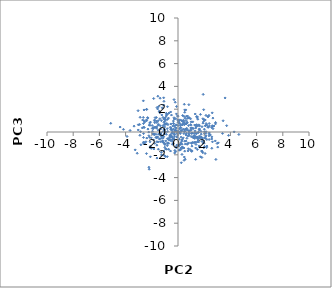
| Category | Series 0 |
|---|---|
| -1.770773030415562 | -0.993 |
| 1.2708219097555649 | -0.432 |
| -0.44278270195938446 | -0.823 |
| -4.41454984896184 | 0.434 |
| -5.133749814817361 | 0.765 |
| 0.8096248342408197 | -0.96 |
| 1.4202953427229223 | 1.36 |
| 0.23058405423241887 | -0.454 |
| 0.8552295948839299 | -0.294 |
| 1.6408714527854273 | -0.354 |
| 1.833774850568358 | -0.83 |
| -0.1593516304962619 | -1.332 |
| -0.5717417460251702 | -1.67 |
| 0.679207117197629 | -0.552 |
| -1.8882535997440149 | 0.294 |
| -0.49223799877375 | -0.358 |
| -0.06607090825979167 | -0.459 |
| -1.8792210986466729 | -0.165 |
| -1.3914535316848833 | 1.681 |
| -0.40398896358329384 | 0.522 |
| -1.2968323454798238 | -0.185 |
| 2.3887938282020356 | -0.079 |
| -0.8154666764966035 | -1.199 |
| 2.0967381269967484 | 0.572 |
| -0.2115033087106913 | 2.611 |
| 0.785444107646185 | -1.469 |
| 0.3004520155237654 | -0.722 |
| 1.484604943745261 | 0.515 |
| -1.5247689200022363 | -0.87 |
| 2.3632321469273667 | -0.333 |
| -1.7730584837282417 | 0.816 |
| -0.5532480216955056 | -0.745 |
| -1.1457778734924273 | 1.279 |
| -1.073083981042333 | 2.692 |
| 0.3237686417166945 | -0.642 |
| 0.8204451007937686 | 0.126 |
| 0.017767917306577397 | 0.048 |
| -1.6029772326678342 | -0.485 |
| 0.733424525418667 | 1.397 |
| -2.106998376268232 | -2.176 |
| -1.6133604774944108 | -1.154 |
| 1.3158840812286252 | 1.58 |
| -0.3334460610834917 | -0.64 |
| 1.0936966474616152 | 0.325 |
| 1.0010432798601487 | 0.889 |
| -0.6698593162144708 | -0.715 |
| -1.6513576834365244 | 1.27 |
| -1.632077399189201 | 0.329 |
| -1.497056879241306 | -1.508 |
| -1.8147000590486022 | -0.244 |
| 0.5056905262095578 | 0.059 |
| 2.581129350229505 | -1.427 |
| 0.09606050562298879 | -0.636 |
| -1.0151898481086152 | 0.923 |
| -2.906987102545036 | -0.288 |
| -0.011819591309675683 | 1.046 |
| 1.9266814156260066 | -0.969 |
| -1.1809288711759587 | -0.341 |
| 1.1841221434657492 | -0.51 |
| -2.157328209027801 | 0.791 |
| -2.6328130863057697 | -0.479 |
| -1.274210288367069 | -0.544 |
| 2.6716049550424503 | 0.289 |
| 1.130813511499732 | -0.098 |
| 1.451557196755277 | -0.542 |
| -2.1384478885076263 | 0.587 |
| 1.6505061755849384 | -1.337 |
| 0.48836575361553874 | 0.643 |
| -0.12989539683335347 | 0.348 |
| 1.1400784164280158 | -0.458 |
| -0.9508500515134614 | 1.05 |
| -2.629831521631357 | -0.14 |
| -1.654619818512633 | -0.499 |
| 2.619792333716752 | 0.553 |
| 0.6360209018334255 | -0.122 |
| -1.6199631464882787 | 0.461 |
| 0.549418678747734 | -2.384 |
| -1.0936541156955037 | -0.417 |
| -0.8559991996326601 | 0.744 |
| 0.5136372295314239 | 0.773 |
| 0.1527905404217271 | 0.729 |
| -1.0848156405839318 | -0.932 |
| 0.0985659598466122 | -1.596 |
| -3.352537366571904 | 0.514 |
| -1.023074680788729 | 0.441 |
| 0.8420648590142967 | 1.22 |
| -2.5965300663404665 | -0.906 |
| 2.1450121142031175 | 0.74 |
| -0.952782868054777 | -0.007 |
| -1.1438441084628033 | 0.539 |
| 0.06730245747595323 | 0.948 |
| 1.9972141680429563 | -0.974 |
| 1.2790540727628714 | -0.909 |
| 0.4435164655634467 | 1.381 |
| 1.4958960808631632 | -0.869 |
| -0.34853033355402646 | 0.963 |
| -0.9350937205515695 | -0.783 |
| 0.7038351224379128 | 0.802 |
| 2.393646902086329 | -0.181 |
| 0.9756080507386801 | 0.354 |
| -1.364887833240019 | 2.965 |
| 1.6378585892965212 | 0.17 |
| 1.0427436681749254 | -1.701 |
| -1.4725949716630846 | 0.661 |
| -0.15150327067968697 | 0.631 |
| 1.6447106082163312 | 0.531 |
| 0.9587493245942178 | 1.156 |
| -1.1624577204811912 | -0.761 |
| -0.7254483847848854 | -0.606 |
| -0.1201816677346672 | 1.588 |
| 2.5732087623513324 | 0.388 |
| 0.4159084951420334 | 1.036 |
| 1.8803398890741594 | -1.808 |
| -0.30260759408307686 | -0.222 |
| 0.5379510058493705 | 1.214 |
| 1.0057405845292922 | -0.403 |
| -3.658543385037247 | 0.134 |
| 0.016027433850447078 | -1.117 |
| -1.4158014430763717 | -0.622 |
| 4.646761786488473 | -0.213 |
| 2.6132087019181034 | 1.68 |
| -0.9649178936364914 | 1.242 |
| -1.6297425751573926 | 0.947 |
| 3.5962690261122265 | 2.989 |
| 0.512448026854724 | 0.181 |
| 1.8595387024394352 | -0.564 |
| -0.35098121539937077 | 0.763 |
| -2.448704796266688 | -0.858 |
| 0.39257346749581085 | 0.246 |
| -1.2923149604435797 | -0.072 |
| -2.1914467939403575 | 0.608 |
| -1.8456284022534746 | 0.381 |
| 1.7717894672094698 | -0.185 |
| 0.7175921600395565 | 1.199 |
| -0.7700814160699351 | 0.646 |
| 1.712331672154607 | 1.545 |
| -0.3232759534978555 | -0.605 |
| 2.8924673009222532 | -2.404 |
| 1.3585567440954711 | 0.588 |
| 0.45011208210697956 | -1.407 |
| 1.127280164532911 | -0.912 |
| 1.7113442220450783 | -2.173 |
| -2.294496749674711 | 0.255 |
| -0.7827625730704746 | 0.05 |
| 0.6408380208373485 | 1.388 |
| 2.360833752654873 | 1.462 |
| 0.7336880007343669 | -1.029 |
| -1.5354180137332258 | 3.139 |
| -0.452942034722425 | 0.146 |
| -0.5968925739014823 | -0.446 |
| 2.1109120889094615 | -0.544 |
| -2.5351748489551533 | 0.883 |
| -0.8241101155554136 | -2.164 |
| -2.608475511571493 | -1.021 |
| -2.636910255669547 | -0.896 |
| 0.3564505687257455 | 1.451 |
| -1.7872836373490424 | 0.978 |
| 1.5528845622078085 | -0.046 |
| -1.3565592028720024 | -0.85 |
| 2.618504755424037 | 0.483 |
| 2.631759138476437 | -0.859 |
| -0.33130301670068235 | 0.253 |
| -1.3767535767994694 | 1.161 |
| -2.112096335548832 | -1.386 |
| -2.2180645990886596 | -3.09 |
| 1.7405041481915124 | -0.419 |
| -2.220340095265973 | -0.327 |
| 1.1687047990927888 | 0.305 |
| 2.575657411615186 | -0.612 |
| -2.8922857939016 | 1.29 |
| -1.5039283564603214 | 0.608 |
| 0.6114146879589705 | 1.02 |
| 0.6189078618452084 | -0.263 |
| 0.17310975900228776 | 0.403 |
| -2.5615732802259195 | -0.993 |
| 1.8475287186691842 | -1.693 |
| -2.722422125372478 | 0.357 |
| 2.3835582315840926 | 0.744 |
| 0.22760631143899498 | -1.518 |
| -1.5549252699037108 | 2.024 |
| -1.2025234128343478 | 2.122 |
| -0.1889009981377829 | 0.121 |
| -0.06415504068273552 | -0.1 |
| -1.9674529975578736 | 0.568 |
| 0.005136926018381358 | 0.851 |
| -1.0788467789906713 | 1.132 |
| 2.197828716549543 | -0.661 |
| -2.0398109017540236 | -0.512 |
| 2.1418212703275534 | 0.024 |
| -1.234935755987102 | 1.496 |
| 0.830276561880193 | 2.397 |
| 1.5696790843080406 | -0.876 |
| 1.4364564921957228 | -0.072 |
| 0.30439185918080314 | -1.966 |
| -0.5185771845020767 | 0.332 |
| 1.2218535001852646 | -0.935 |
| -0.5701855080660908 | -0.231 |
| -1.345487882818263 | 0.539 |
| -2.4056706477393917 | -1.893 |
| -2.303697592814866 | 1.224 |
| -0.42263655109089854 | -1.077 |
| -2.827042687866384 | -1.119 |
| 0.2932120014354334 | -0.822 |
| 2.1324774411851917 | -0.351 |
| 0.0340748861091904 | 0.022 |
| -0.10353120615256446 | -1.39 |
| -0.8962548048005238 | 1.644 |
| 1.624695145516196 | 0.224 |
| 0.3895244818363946 | -1.401 |
| 3.445724591339473 | 0.985 |
| -0.03328593570087176 | 1.416 |
| -3.2674455023121585 | -1.569 |
| -0.16118568380696585 | 1.167 |
| -0.8231708863826445 | -1.014 |
| -0.822731349624263 | 0.291 |
| 2.3144872799771075 | 0.412 |
| -0.2050106659789492 | 0.151 |
| 1.968705682154531 | -1.385 |
| -0.25821096783495534 | -0.242 |
| 0.4488114260346506 | -0.142 |
| -1.0091807787300764 | 1.125 |
| 1.5899996256989934 | 0.627 |
| -2.159427357617791 | -0.474 |
| -1.6718651136496223 | 0.404 |
| -2.388378360639858 | 1.986 |
| -0.4610899406686838 | -0.094 |
| 0.5959717350970156 | 1.935 |
| -0.057505572855346375 | -0.435 |
| -0.2839934924452516 | -0.102 |
| 2.9851606201667797 | -1 |
| -1.0665916907824848 | 0.843 |
| -0.9660218389833736 | -2.151 |
| -0.42939738971669955 | -0.491 |
| 0.5223898942317594 | -0.805 |
| 2.023352088697698 | 0.023 |
| -0.7070653026447721 | -1.515 |
| 1.352704397467027 | 0.349 |
| -0.21528644783510018 | 0.081 |
| 2.86159576373404 | 0.713 |
| -1.1872900414398933 | -0.833 |
| 0.9636208103021175 | 0.652 |
| -1.1213143735371067 | -0.928 |
| -2.6493810463897796 | 1.277 |
| -3.030604046696561 | 0.632 |
| 0.6158239212588049 | 0.701 |
| 1.2098411059844225 | -0.325 |
| -0.8870844516535282 | -0.202 |
| -0.278610932170138 | 0.546 |
| -0.11351828939800537 | 0.606 |
| 0.9791904040463372 | 0.136 |
| 0.8380333069409228 | -0.06 |
| 2.6635518697673994 | 1.219 |
| -1.5069216803419172 | 0.993 |
| 0.3077174422246217 | -1.072 |
| -0.26514170605409176 | -0.406 |
| -2.1961554805636987 | -3.265 |
| 2.277831894751687 | 0.426 |
| -2.323297970324233 | 1.264 |
| 1.4771155017910889 | 1.331 |
| -1.8447603679903697 | -1.491 |
| 0.513073557767933 | -1.681 |
| -0.5901379924224587 | -0.674 |
| 0.620412420169689 | -0.8 |
| -0.783721943651005 | -0.947 |
| -0.11949450516950205 | 0.122 |
| 1.9016710600125264 | 0.779 |
| -0.10990328756567562 | 2.239 |
| -1.9184784448893304 | -0.168 |
| 0.09959108081537481 | -0.047 |
| 0.21889988500333463 | -0.971 |
| 0.07257273691981801 | 0.799 |
| -2.6344859696922365 | 0.742 |
| 1.0390420217029948 | 0.36 |
| -1.0947331125786854 | 2.998 |
| -0.3578654855381629 | -1.001 |
| -1.870230383128912 | -0.689 |
| 0.2507129524423555 | -2.698 |
| 1.4762007029622453 | -0.433 |
| 0.06351553740941794 | -1.232 |
| -2.8587057897857937 | 0.028 |
| -2.397761298740665 | 0.99 |
| 1.6820464989102792 | -0.535 |
| 1.6116416023831346 | -1.224 |
| -0.8022344055084909 | 1.104 |
| -0.5603843771506064 | 1.756 |
| -1.4221039017982688 | -0.227 |
| -1.316213387095079 | 0.273 |
| -1.2709566438272546 | -1.789 |
| 0.24938960324197632 | 0.055 |
| -0.8030247817324296 | 2.218 |
| -0.9553543829695298 | -1.489 |
| -2.108304816904536 | -1.254 |
| 0.8225830783625154 | -0.179 |
| -0.009692697374128027 | 1.376 |
| -0.20684313335016127 | 0.402 |
| -0.9036487903400565 | 1.399 |
| -0.6040845612560928 | -0.42 |
| 1.5533508598523553 | -0.026 |
| 2.1315460557979895 | -0.129 |
| -1.483385984840821 | -0.185 |
| 3.3999606914669975 | -0.126 |
| 0.002782611206489476 | 0.571 |
| -1.6820909128843087 | -0.201 |
| -1.289515240572203 | -0.342 |
| 3.7142629554757582 | 0.555 |
| -0.836136902916437 | 1.541 |
| 0.8534079442112462 | 1.26 |
| 1.3712539153051129 | 0.452 |
| -1.0099147308199952 | -1.339 |
| 0.32605386245685974 | 0.612 |
| 0.91850324087744 | -1.536 |
| 1.3151310160380043 | -0.449 |
| -0.2910812637892004 | 1.146 |
| -1.1243614494363128 | 0.058 |
| 2.2063390922150394 | -1.235 |
| -1.1284275620188138 | -0.524 |
| 0.8049365705781024 | 0.563 |
| 1.3749436858280375 | -1.087 |
| -0.6243400697759771 | -0.349 |
| 1.5018945854824894 | -0.5 |
| 0.5122851347862563 | 1.939 |
| 2.468255295443262 | -0.26 |
| -1.855645453848338 | 2.935 |
| -0.5485500078676094 | 0.231 |
| -1.555994657408389 | -0.425 |
| 0.699618876024173 | 0.172 |
| 2.269902256863006 | 1.339 |
| 2.8682972991126277 | 0.838 |
| -2.404411882151312 | 1.992 |
| 0.7013842003309095 | -1.081 |
| 1.799923236079031 | -1.668 |
| -0.9904903274328265 | 0.685 |
| 0.2269497667762964 | 0.367 |
| 2.847754682916256 | -0.783 |
| 1.350100620146544 | -1.403 |
| 1.6339314539373917 | 0.275 |
| 2.185296330792842 | -1.367 |
| 1.3640564058827418 | -0.897 |
| -0.3459076147279976 | 0.739 |
| 1.043819938789945 | -1.002 |
| 0.02370856404308571 | 1.015 |
| -2.038427478997342 | -1.44 |
| 2.0650761800066926 | -1.884 |
| -0.6132414921331305 | -0.344 |
| 1.0649562590410293 | -1.24 |
| -0.2990121779461759 | 2.84 |
| -2.3987599428532986 | 1.061 |
| 1.2728227540809884 | 0.613 |
| -1.0837013744098463 | -1.666 |
| -1.6119096896384069 | -0.85 |
| 1.4544170146182447 | -0.447 |
| -1.0341702407869326 | 1.205 |
| 0.672533862989043 | 0.318 |
| -1.0490955060702165 | -0.177 |
| 1.283982272478106 | -0.092 |
| -1.6824096175646506 | -0.468 |
| 1.5355660392425812 | -0.705 |
| -0.553401543597528 | -0.337 |
| 1.0206587921819508 | -0.122 |
| -1.746365600721811 | 1.256 |
| 0.1755114830170994 | -0.14 |
| 0.11133412968785728 | 0.267 |
| 0.3000586768635352 | 0.132 |
| -1.8092573820007989 | -0.171 |
| -2.136189022150151 | -0.859 |
| -1.9625012034125109 | 0.312 |
| 1.8065278874921997 | -0.477 |
| 1.459520944619808 | 1.249 |
| -0.4992568011840012 | 1.485 |
| -1.8780894900601213 | 0.381 |
| 2.027058481806508 | -1.265 |
| 0.37586818021170687 | -1.361 |
| 1.4205933939612365 | 0.642 |
| -1.0048914635035602 | -1.103 |
| -2.6348662423800313 | 0.42 |
| -2.5930816454058743 | 0.979 |
| -1.437021225427406 | 1.824 |
| 0.6255349051692217 | 0.274 |
| 0.6417294227046143 | 0.725 |
| -1.4713884893229636 | 2.237 |
| 0.4041403405321482 | 0.872 |
| -2.2305614270404233 | -0.012 |
| 2.133887280060247 | 1.457 |
| 1.0633937850805655 | -0.11 |
| -0.43631534914326525 | -0.453 |
| 2.0797859941832137 | 1.052 |
| -0.6928007720023673 | 1.66 |
| 2.3124237220894717 | 1.352 |
| -1.3954058829599056 | -0.593 |
| 0.7684231560189605 | -1.659 |
| -0.031306186743903605 | -0.264 |
| -0.8412873713478891 | 1.526 |
| -0.4323815376700206 | -0.652 |
| 1.900750712968277 | 1.163 |
| 0.3285226914223846 | 0.657 |
| 0.5403906648875655 | 0.235 |
| -1.0511689287083845 | 0.652 |
| 2.7461590975121903 | 0.528 |
| 0.5582308364585427 | -1.057 |
| 0.33488919366542447 | 0.967 |
| -1.0180131441248483 | 0.18 |
| 1.5610195090136507 | -0.508 |
| 1.9206678861584352 | 3.3 |
| -2.643410506406758 | 2.731 |
| -1.1855124295788875 | -0.873 |
| -1.5996548430434165 | 2.151 |
| 1.4037030732677929 | -0.158 |
| 1.7539422321666247 | 0.051 |
| -1.6012839957259644 | -0.468 |
| -3.1119347471479184 | -1.865 |
| 2.092432608312845 | 0.533 |
| -0.2385166896686258 | -1.616 |
| -1.26638555206595 | 0.994 |
| 0.9904712382965791 | 0.201 |
| 1.8325109037032037 | 0.463 |
| -0.6996858742218763 | -0.557 |
| -0.17574934412765753 | -1.719 |
| 2.5792347315736053 | -0.432 |
| -1.6109896962196244 | 0.824 |
| -0.542245929558051 | 0.706 |
| 1.2770610549249508 | -0.566 |
| -2.9283889220848374 | 0.662 |
| -0.8091702937248885 | -0.585 |
| -2.103739687664873 | 0.867 |
| -0.2559055932943086 | -1.84 |
| 0.5089023896617878 | 0.046 |
| -0.9105817985965065 | 0.682 |
| 0.9972332892388701 | 0.6 |
| -0.8623578045300014 | -1.513 |
| 0.14213633622087535 | 1.063 |
| 0.27460863289864146 | 1.004 |
| 2.202836815358501 | 0.609 |
| 0.2291056946663399 | 0.142 |
| 0.1184212289787045 | -1.585 |
| 1.9603766915341327 | 1.955 |
| -3.0464452858717523 | 1.87 |
| -1.5059157934798268 | 0.167 |
| -1.9473936147043416 | 0.068 |
| 1.9562791153614616 | 0.941 |
| 0.4645574747226678 | 0.913 |
| 0.4812584013695703 | 2.434 |
| 1.1276797487009818 | 0.891 |
| -1.0890207196648458 | 2.359 |
| 0.4814712809091514 | -2.195 |
| -2.575738232083502 | 0.396 |
| -2.695901052421431 | 1.049 |
| 2.030972605635861 | -0.496 |
| 0.18300275097287272 | -1.097 |
| 0.7567149767879373 | -0.361 |
| 3.0777407827378402 | -0.952 |
| 3.033081635597566 | -1.326 |
| 1.0216373447511027 | -0.953 |
| -1.0550691646760002 | 0.236 |
| 2.377830457458659 | -0.658 |
| 3.860310847970096 | -0.297 |
| -0.09897790545941941 | -1.155 |
| -0.5949630080986251 | 0.406 |
| 0.1283710192527326 | -1.573 |
| -0.9744156157680001 | 0.679 |
| -1.0113965214179927 | -1.044 |
| 1.9754088131083378 | 1.093 |
| 2.0115518273432493 | 0.248 |
| -1.6071121749378705 | -2.289 |
| 0.5136008194974041 | 1.733 |
| -1.038930884122116 | -2.064 |
| 1.475716155625606 | -1.534 |
| 0.8501572199634992 | 0.078 |
| 0.4669162398746335 | -2.481 |
| 2.396272341902228 | 0.529 |
| -3.891176922387855 | -0.39 |
| 1.8180900495657355 | -2.233 |
| 2.0280785348132673 | -0.142 |
| -1.755233336648225 | 0.428 |
| 1.296717657954982 | 0.098 |
| 0.32058276703156985 | -1.316 |
| 1.3445071205654613 | -2.399 |
| -0.40714356953690495 | 0.002 |
| -2.595313148190803 | 1.934 |
| 1.2798841307234938 | -0.292 |
| -1.7842772118282646 | 1.049 |
| -1.2604195312078648 | -2.012 |
| -4.164361697088246 | 0.233 |
| 1.9450928067400473 | -0.777 |
| 0.1778495695388655 | 0.592 |
| -0.7106355452680796 | -0.996 |
| -0.3052915876630851 | 1.25 |
| 0.40010033847831455 | -0.513 |
| -2.380697970086746 | -0.534 |
| 2.021774105568592 | 1.062 |
| -3.0333527569873984 | 0.178 |
| -0.19830525643916083 | 0.139 |
| -0.7277715590698072 | 1.221 |
| 0.6919576595335958 | 0.859 |
| 1.0428799817206327 | -1.646 |
| 1.514317545605351 | 1.123 |
| 1.0296422226635793 | -1.655 |
| 4.284430989735139 | 0.011 |
| -0.4846402216849995 | 0.214 |
| 0.40845557256747983 | 0.715 |
| 0.20772036715880074 | -1.408 |